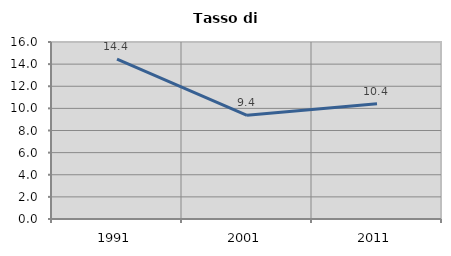
| Category | Tasso di disoccupazione   |
|---|---|
| 1991.0 | 14.448 |
| 2001.0 | 9.377 |
| 2011.0 | 10.424 |